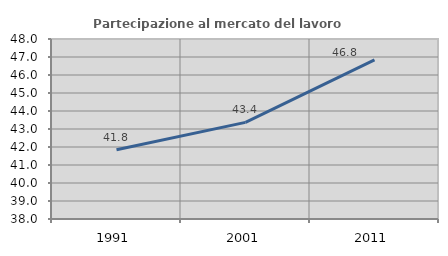
| Category | Partecipazione al mercato del lavoro  femminile |
|---|---|
| 1991.0 | 41.845 |
| 2001.0 | 43.369 |
| 2011.0 | 46.838 |